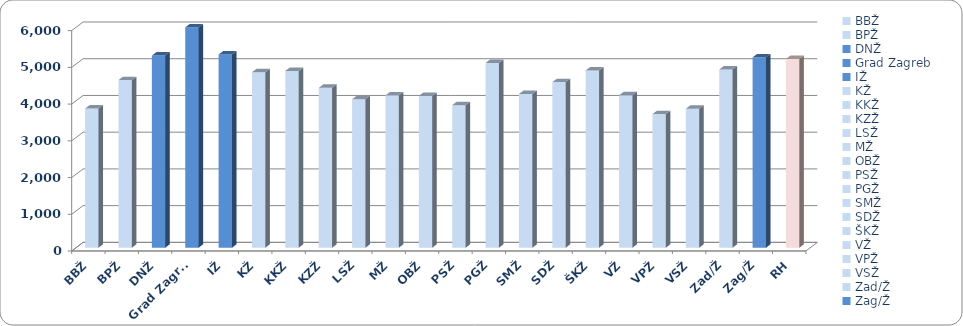
| Category | Prosječne mjesečne plaće po zaposlenom (u kunama) |
|---|---|
| BBŽ | 3789.516 |
| BPŽ | 4563.928 |
| DNŽ | 5232.611 |
| Grad Zagreb | 5999.75 |
| IŽ | 5260.825 |
| KŽ | 4778.553 |
| KKŽ | 4814.991 |
| KZŽ | 4353.725 |
| LSŽ | 4043.429 |
| MŽ | 4149.428 |
| OBŽ | 4134.358 |
| PSŽ | 3882.736 |
| PGŽ | 5032.041 |
| SMŽ | 4187.105 |
| SDŽ | 4509.143 |
| ŠKŽ | 4827.451 |
| VŽ | 4151.854 |
| VPŽ | 3638.643 |
| VSŽ | 3783.349 |
| Zad/Ž | 4852.187 |
| Zag/Ž | 5183.185 |
| RH | 5140.433 |